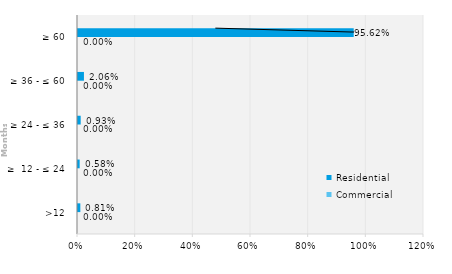
| Category | Commercial | Residential |
|---|---|---|
| >12 | 0 | 0.008 |
| ≥  12 - ≤ 24 | 0 | 0.006 |
| ≥ 24 - ≤ 36 | 0 | 0.009 |
| ≥ 36 - ≤ 60 | 0 | 0.021 |
| ≥ 60 | 0 | 0.956 |